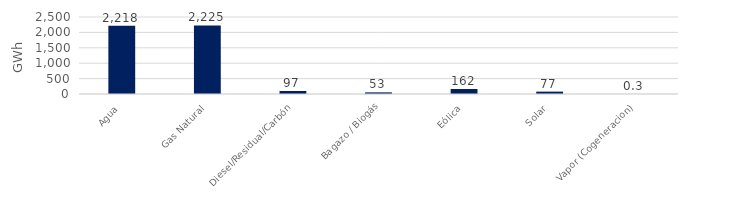
| Category | Series 0 |
|---|---|
| Agua | 2218.175 |
| Gas Natural | 2225.464 |
| Diesel/Residual/Carbón | 96.757 |
| Bagazo / Biogás | 52.534 |
| Eólica | 162.143 |
| Solar | 77.07 |
| Vapor (Cogeneracion) | 0.34 |